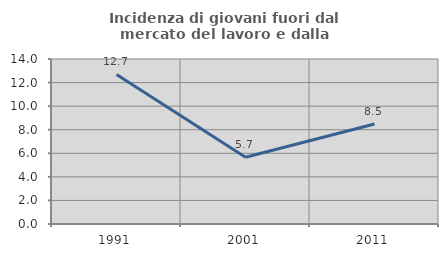
| Category | Incidenza di giovani fuori dal mercato del lavoro e dalla formazione  |
|---|---|
| 1991.0 | 12.69 |
| 2001.0 | 5.66 |
| 2011.0 | 8.485 |